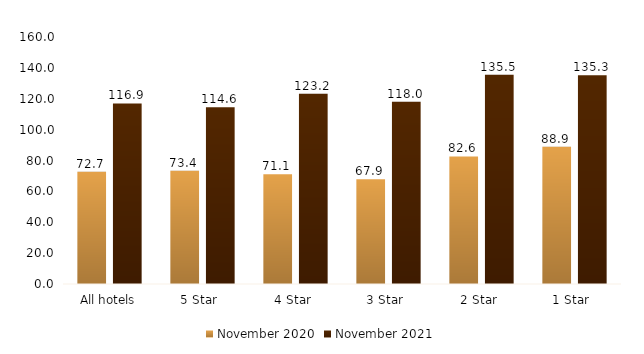
| Category | November 2020 | November 2021 |
|---|---|---|
| All hotels | 72.659 | 116.926 |
| 5 Star  | 73.374 | 114.562 |
| 4 Star  | 71.123 | 123.22 |
| 3 Star  | 67.856 | 118.019 |
| 2 Star  | 82.61 | 135.477 |
| 1 Star  | 88.934 | 135.292 |